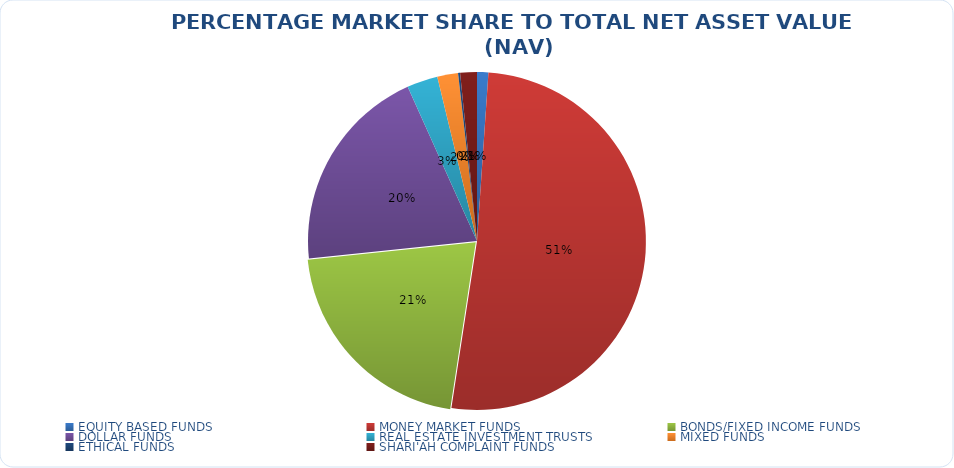
| Category | NET ASSET VALUE |
|---|---|
| EQUITY BASED FUNDS | 17022340090.36 |
| MONEY MARKET FUNDS | 808555564328.638 |
| BONDS/FIXED INCOME FUNDS | 329560582532.399 |
| DOLLAR FUNDS | 313889534077.089 |
| REAL ESTATE INVESTMENT TRUSTS | 46448137747.11 |
| MIXED FUNDS | 31270923143.618 |
| ETHICAL FUNDS | 3062737011.37 |
| SHARI'AH COMPLAINT FUNDS | 25123628784.88 |